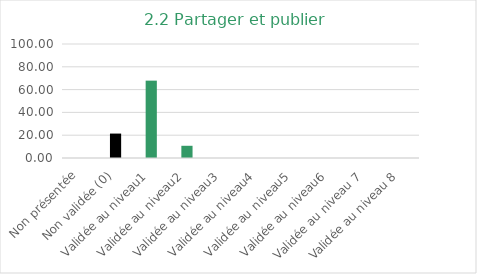
| Category | Series 0 |
|---|---|
| Non présentée | 0 |
| Non validée (0) | 21.429 |
| Validée au niveau1 | 67.857 |
| Validée au niveau2 | 10.714 |
| Validée au niveau3 | 0 |
| Validée au niveau4 | 0 |
| Validée au niveau5 | 0 |
| Validée au niveau6 | 0 |
| Validée au niveau 7 | 0 |
| Validée au niveau 8 | 0 |